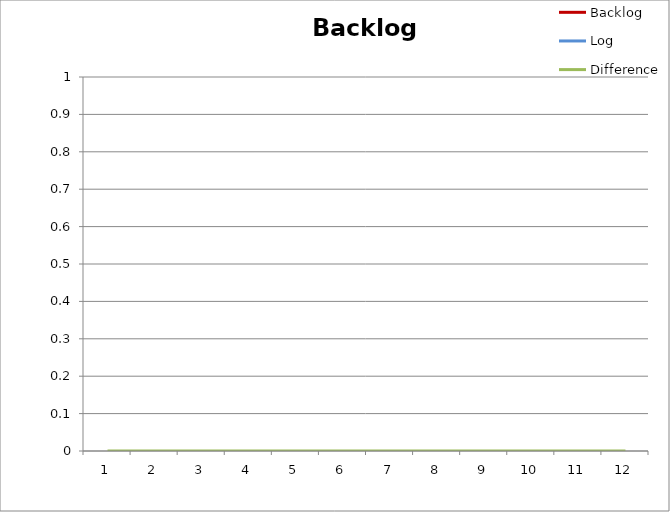
| Category | Backlog | Log | Difference |
|---|---|---|---|
| 0 |  |  | 0 |
| 1 |  |  | 0 |
| 2 |  |  | 0 |
| 3 |  |  | 0 |
| 4 |  |  | 0 |
| 5 |  |  | 0 |
| 6 |  |  | 0 |
| 7 |  |  | 0 |
| 8 |  |  | 0 |
| 9 |  |  | 0 |
| 10 |  |  | 0 |
| 11 |  |  | 0 |